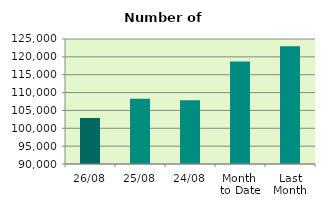
| Category | Series 0 |
|---|---|
| 26/08 | 102890 |
| 25/08 | 108268 |
| 24/08 | 107824 |
| Month 
to Date | 118679.895 |
| Last
Month | 122991 |